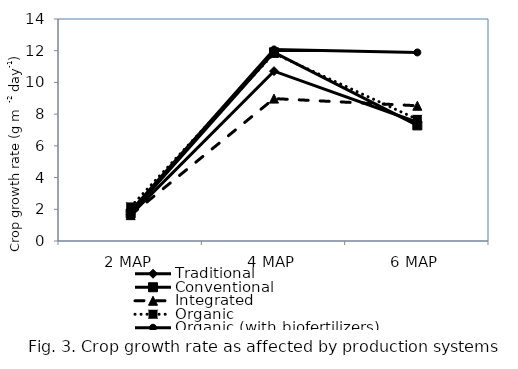
| Category | Traditional | Conventional | Integrated | Organic  | Organic (with biofertilizers) |
|---|---|---|---|---|---|
| 2 MAP | 1.65 | 1.74 | 1.63 | 2.15 | 1.9 |
| 4 MAP | 10.71 | 11.9 | 8.98 | 11.83 | 12.08 |
| 6 MAP | 7.49 | 7.29 | 8.53 | 7.67 | 11.89 |